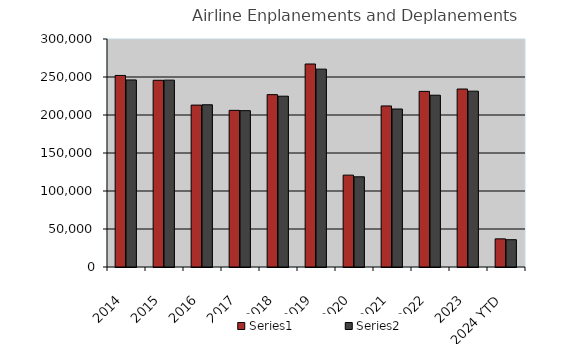
| Category | Series 0 | Series 1 |
|---|---|---|
| 2014 | 252052 | 246146 |
| 2015 | 245672 | 245880 |
| 2016 | 213024 | 213466 |
| 2017 | 206100 | 205718 |
| 2018 | 226803 | 224740 |
| 2019 | 267100 | 260360 |
| 2020 | 120877 | 118658 |
| 2021 | 211912 | 207884 |
| 2022 | 231095 | 226011 |
| 2023 | 234177 | 231353 |
| 2024 YTD | 37042 | 35926 |